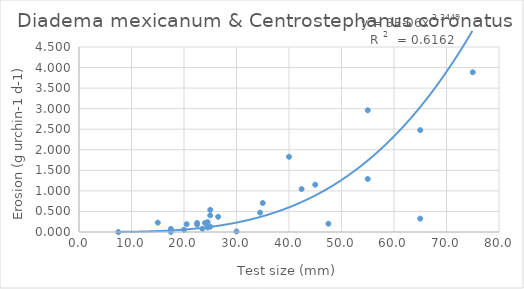
| Category | Series 0 |
|---|---|
| 20.5 | 0.19 |
| 24.5 | 0.24 |
| 22.5 | 0.18 |
| 22.5 | 0.22 |
| 24.5 | 0.11 |
| 24.0 | 0.22 |
| 23.5 | 0.08 |
| 26.5 | 0.37 |
| 34.5 | 0.47 |
| 25.0 | 0.54 |
| 40.0 | 1.83 |
| 55.0 | 2.96 |
| 15.0 | 0.227 |
| 25.0 | 0.404 |
| 35.0 | 0.705 |
| 45.0 | 1.15 |
| 55.0 | 1.29 |
| 65.0 | 2.478 |
| 75.0 | 3.886 |
| 20.0 | 0.052 |
| 47.5 | 0.202 |
| 65.0 | 0.325 |
| 7.5 | 0 |
| 17.5 | 0.002 |
| 30.0 | 0.013 |
| 42.400000000000006 | 1.044 |
| 17.5 | 0.075 |
| 25.0 | 0.13 |